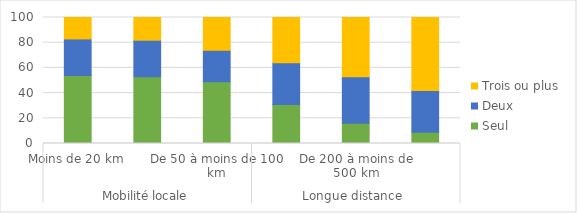
| Category | Seul | Deux | Trois ou plus |
|---|---|---|---|
| 0 | 54 | 29 | 17 |
| 1 | 53 | 29 | 18 |
| 2 | 49 | 25 | 26 |
| 3 | 31 | 33 | 36 |
| 4 | 16 | 37 | 47 |
| 5 | 9 | 33 | 58 |